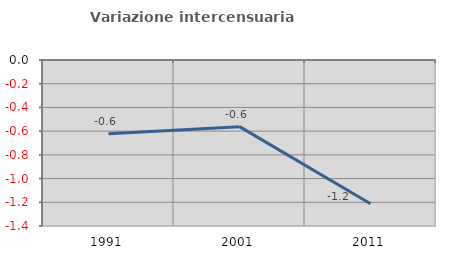
| Category | Variazione intercensuaria annua |
|---|---|
| 1991.0 | -0.621 |
| 2001.0 | -0.562 |
| 2011.0 | -1.212 |